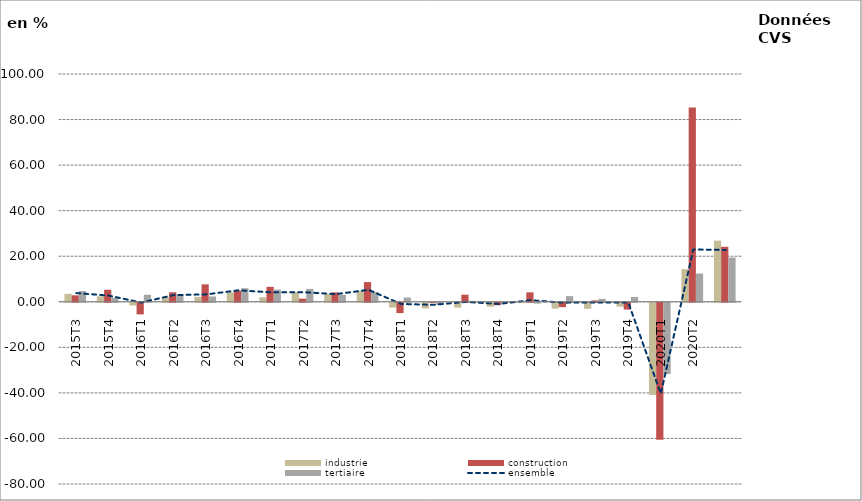
| Category | industrie | construction | tertiaire |
|---|---|---|---|
| 2015T3 | 3.5 | 2.84 | 4.729 |
| 2015T4 | 2.375 | 5.269 | 1.801 |
| 2016T1 | -1.2 | -5.096 | 3.065 |
| 2016T2 | 2.026 | 4.166 | 3.4 |
| 2016T3 | 2.142 | 7.66 | 2.334 |
| 2016T4 | 4.162 | 4.898 | 5.971 |
| 2017T1 | 1.967 | 6.552 | 5.346 |
| 2017T2 | 4.212 | 1.38 | 5.642 |
| 2017T3 | 3.361 | 4.141 | 3.009 |
| 2017T4 | 4.694 | 8.64 | 4.254 |
| 2018T1 | -2.098 | -4.504 | 1.864 |
| 2018T2 | -2.458 | -0.02 | -0.927 |
| 2018T3 | -2.132 | 3.119 | 0.422 |
| 2018T4 | -1.727 | -1.07 | -0.164 |
| 2019T1 | 0.02 | 4.14 | -0.372 |
| 2019T2 | -2.59 | -1.922 | 2.474 |
| 2019T3 | -2.636 | 0.607 | 1.268 |
| 2019T4 | -1.714 | -2.976 | 2.122 |
| 2020T1 | -40.528 | -60.184 | -31.252 |
| 2020T2 | 14.318 | 85.346 | 12.424 |